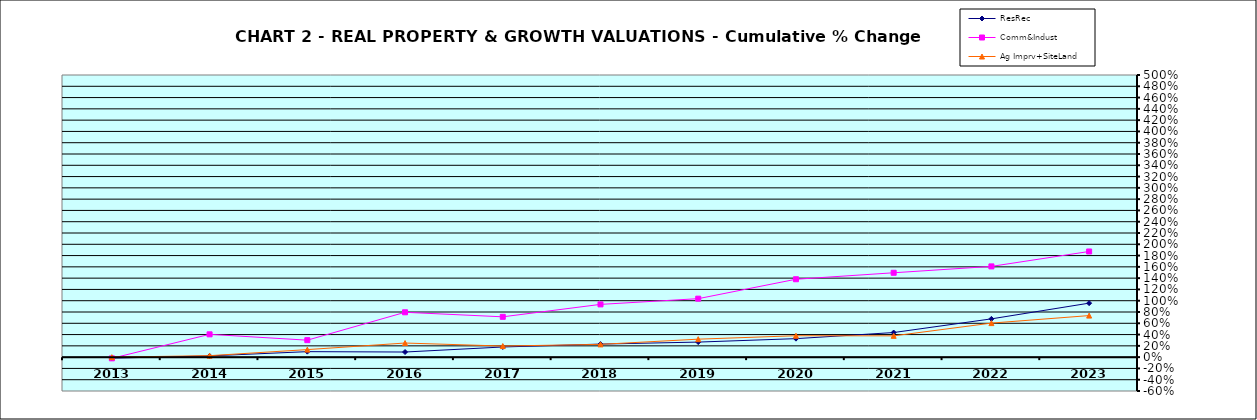
| Category | ResRec | Comm&Indust | Ag Imprv+SiteLand |
|---|---|---|---|
| 2013.0 | -0.017 | -0.021 | 0 |
| 2014.0 | 0.022 | 0.404 | 0.026 |
| 2015.0 | 0.097 | 0.301 | 0.134 |
| 2016.0 | 0.091 | 0.795 | 0.25 |
| 2017.0 | 0.18 | 0.715 | 0.196 |
| 2018.0 | 0.231 | 0.935 | 0.226 |
| 2019.0 | 0.267 | 1.036 | 0.319 |
| 2020.0 | 0.328 | 1.38 | 0.38 |
| 2021.0 | 0.436 | 1.495 | 0.377 |
| 2022.0 | 0.678 | 1.608 | 0.603 |
| 2023.0 | 0.957 | 1.873 | 0.736 |